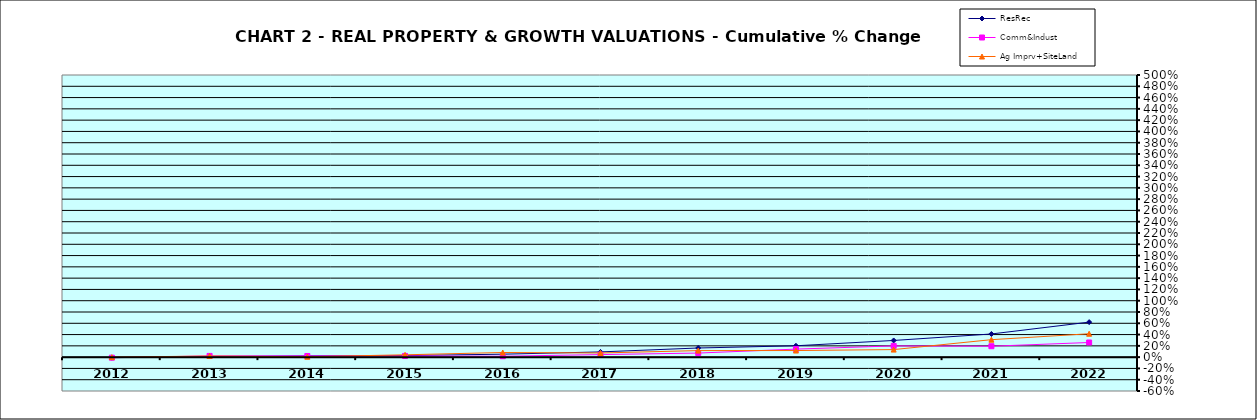
| Category | ResRec | Comm&Indust | Ag Imprv+SiteLand |
|---|---|---|---|
| 2012.0 | -0.009 | -0.009 | 0 |
| 2013.0 | 0.011 | 0.022 | 0.02 |
| 2014.0 | 0.022 | 0.021 | 0.007 |
| 2015.0 | 0.028 | 0.022 | 0.041 |
| 2016.0 | 0.052 | 0.016 | 0.083 |
| 2017.0 | 0.093 | 0.045 | 0.073 |
| 2018.0 | 0.162 | 0.072 | 0.116 |
| 2019.0 | 0.201 | 0.142 | 0.117 |
| 2020.0 | 0.296 | 0.199 | 0.134 |
| 2021.0 | 0.41 | 0.193 | 0.309 |
| 2022.0 | 0.621 | 0.259 | 0.415 |